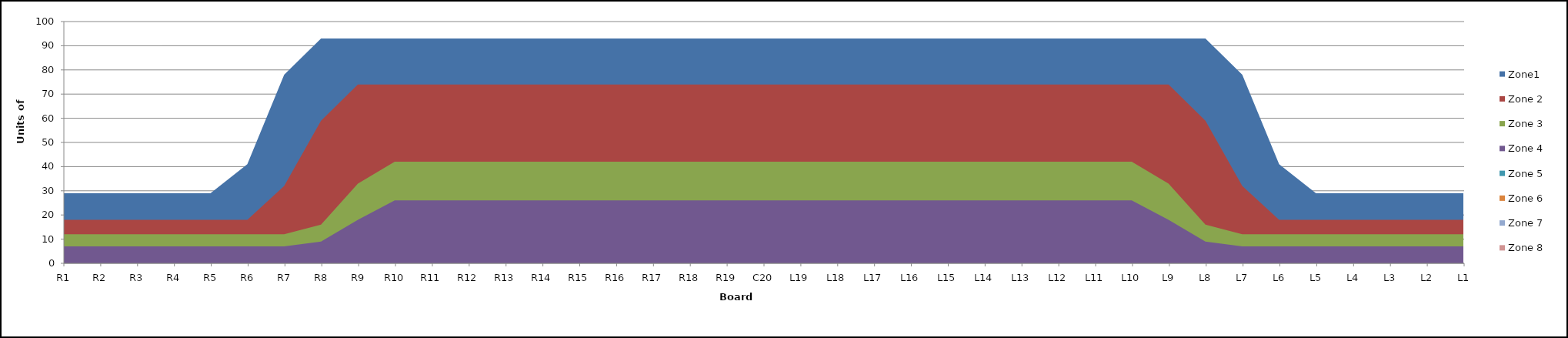
| Category | Zone1 | Zone 2 | Zone 3 | Zone 4 | Zone 5 | Zone 6 | Zone 7 | Zone 8 |
|---|---|---|---|---|---|---|---|---|
| L1 | 29 | 18 | 12 | 7 | 0 |  |  |  |
| L2 | 29 | 18 | 12 | 7 | 0 |  |  |  |
| L3 | 29 | 18 | 12 | 7 | 0 |  |  |  |
| L4 | 29 | 18 | 12 | 7 | 0 |  |  |  |
| L5 | 29 | 18 | 12 | 7 | 0 |  |  |  |
| L6 | 41 | 18 | 12 | 7 | 0 |  |  |  |
| L7 | 78 | 32 | 12 | 7 | 0 |  |  |  |
| L8 | 93 | 59 | 16 | 9 | 0 |  |  |  |
| L9 | 93 | 74 | 33 | 18 | 0 |  |  |  |
| L10 | 93 | 74 | 42 | 26 | 0 |  |  |  |
| L11 | 93 | 74 | 42 | 26 | 0 |  |  |  |
| L12 | 93 | 74 | 42 | 26 | 0 |  |  |  |
| L13 | 93 | 74 | 42 | 26 | 0 |  |  |  |
| L14 | 93 | 74 | 42 | 26 | 0 |  |  |  |
| L15 | 93 | 74 | 42 | 26 | 0 |  |  |  |
| L16 | 93 | 74 | 42 | 26 | 0 |  |  |  |
| L17 | 93 | 74 | 42 | 26 | 0 |  |  |  |
| L18 | 93 | 74 | 42 | 26 | 0 |  |  |  |
| L19 | 93 | 74 | 42 | 26 | 0 |  |  |  |
| C20 | 93 | 74 | 42 | 26 | 0 |  |  |  |
| R19 | 93 | 74 | 42 | 26 | 0 |  |  |  |
| R18 | 93 | 74 | 42 | 26 | 0 |  |  |  |
| R17 | 93 | 74 | 42 | 26 | 0 |  |  |  |
| R16 | 93 | 74 | 42 | 26 | 0 |  |  |  |
| R15 | 93 | 74 | 42 | 26 | 0 |  |  |  |
| R14 | 93 | 74 | 42 | 26 | 0 |  |  |  |
| R13 | 93 | 74 | 42 | 26 | 0 |  |  |  |
| R12 | 93 | 74 | 42 | 26 | 0 |  |  |  |
| R11 | 93 | 74 | 42 | 26 | 0 |  |  |  |
| R10 | 93 | 74 | 42 | 26 | 0 |  |  |  |
| R9 | 93 | 74 | 33 | 18 | 0 |  |  |  |
| R8 | 93 | 59 | 16 | 9 | 0 |  |  |  |
| R7 | 78 | 32 | 12 | 7 | 0 |  |  |  |
| R6 | 41 | 18 | 12 | 7 | 0 |  |  |  |
| R5 | 29 | 18 | 12 | 7 | 0 |  |  |  |
| R4 | 29 | 18 | 12 | 7 | 0 |  |  |  |
| R3 | 29 | 18 | 12 | 7 | 0 |  |  |  |
| R2 | 29 | 18 | 12 | 7 | 0 |  |  |  |
| R1 | 29 | 18 | 12 | 7 | 0 |  |  |  |